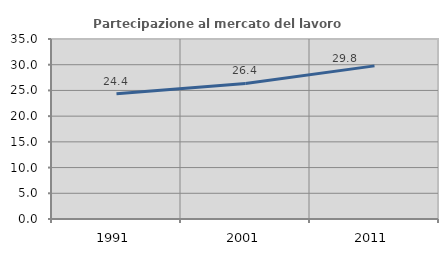
| Category | Partecipazione al mercato del lavoro  femminile |
|---|---|
| 1991.0 | 24.363 |
| 2001.0 | 26.359 |
| 2011.0 | 29.776 |